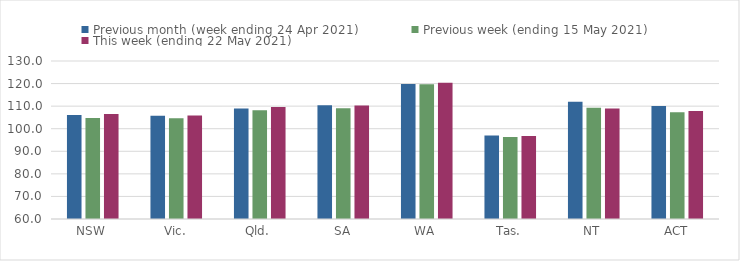
| Category | Previous month (week ending 24 Apr 2021) | Previous week (ending 15 May 2021) | This week (ending 22 May 2021) |
|---|---|---|---|
| NSW | 106.08 | 104.76 | 106.49 |
| Vic. | 105.79 | 104.66 | 105.81 |
| Qld. | 108.94 | 108.19 | 109.64 |
| SA | 110.35 | 109.04 | 110.24 |
| WA | 119.79 | 119.71 | 120.41 |
| Tas. | 97.04 | 96.34 | 96.74 |
| NT | 111.92 | 109.29 | 109.01 |
| ACT | 110.08 | 107.29 | 107.88 |